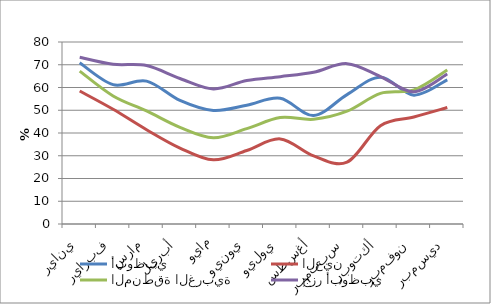
| Category | أبوظبي | العين | المنطقة الغربية | جزر أبوظبي |
|---|---|---|---|---|
| يناير | 70.863 | 58.452 | 67.18 | 73.264 |
| فبراير | 61.246 | 50.435 | 56.271 | 70.194 |
| مارس | 62.815 | 41.458 | 49.679 | 69.658 |
| أبريل | 54.308 | 33.391 | 42.458 | 63.973 |
| مايو | 49.928 | 28.197 | 37.918 | 59.391 |
| يونيو | 52.19 | 32.318 | 41.917 | 63.053 |
| يوليو | 55.26 | 37.402 | 46.78 | 64.752 |
| أغسطس | 47.652 | 29.958 | 46.04 | 66.696 |
| سبتمبر | 56.875 | 27.174 | 49.578 | 70.482 |
| أكتوبر | 64.55 | 43.236 | 57.429 | 64.825 |
| نوفمبر | 56.64 | 47.058 | 58.934 | 58.145 |
| ديسمبر | 63.387 | 51.189 | 67.714 | 65.94 |